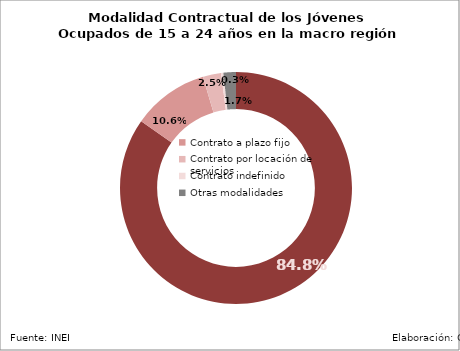
| Category | Series 0 | Series 1 |
|---|---|---|
| Sin contrato |  | 0.848 |
| Contrato a plazo fijo |  | 0.106 |
| Contrato por locación de servicios  |  | 0.025 |
| Contrato indefinido |  | 0.003 |
| Otras modalidades |  | 0.017 |